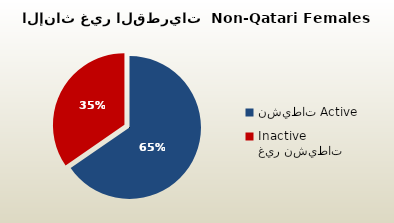
| Category | الاناث غير القطريات  Non-Qatari Females |
|---|---|
| نشيطات Active | 263775 |
| غير نشيطات Inactive | 139615 |